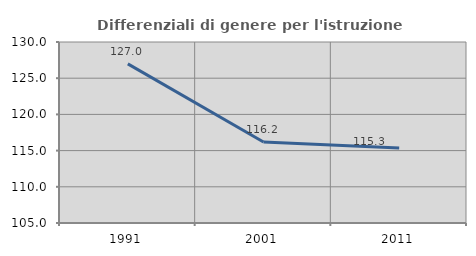
| Category | Differenziali di genere per l'istruzione superiore |
|---|---|
| 1991.0 | 126.979 |
| 2001.0 | 116.184 |
| 2011.0 | 115.346 |